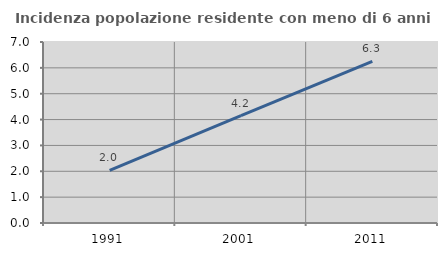
| Category | Incidenza popolazione residente con meno di 6 anni |
|---|---|
| 1991.0 | 2.034 |
| 2001.0 | 4.152 |
| 2011.0 | 6.25 |